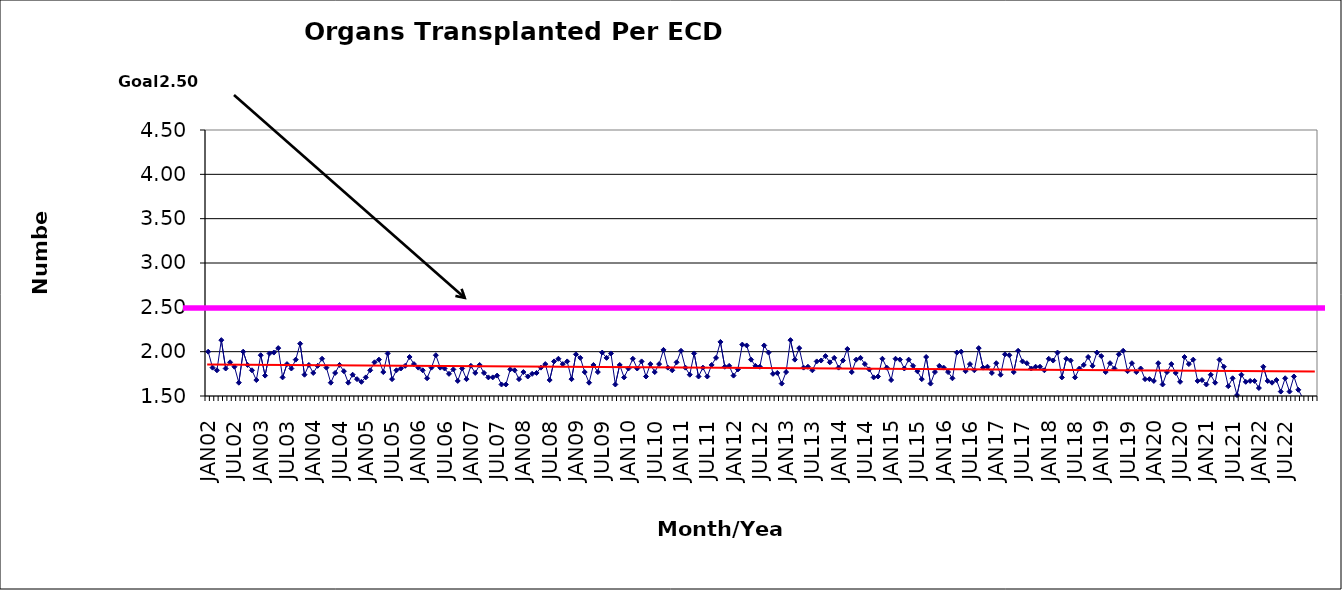
| Category | Series 0 |
|---|---|
| JAN02 | 2 |
| FEB02 | 1.82 |
| MAR02 | 1.79 |
| APR02 | 2.13 |
| MAY02 | 1.81 |
| JUN02 | 1.88 |
| JUL02 | 1.83 |
| AUG02 | 1.65 |
| SEP02 | 2 |
| OCT02 | 1.85 |
| NOV02 | 1.79 |
| DEC02 | 1.68 |
| JAN03 | 1.96 |
| FEB03 | 1.73 |
| MAR03 | 1.98 |
| APR03 | 1.99 |
| MAY03 | 2.04 |
| JUN03 | 1.71 |
| JUL03 | 1.86 |
| AUG03 | 1.81 |
| SEP03 | 1.91 |
| OCT03 | 2.09 |
| NOV03 | 1.74 |
| DEC03 | 1.85 |
| JAN04 | 1.76 |
| FEB04 | 1.84 |
| MAR04 | 1.92 |
| APR04 | 1.82 |
| MAY04 | 1.65 |
| JUN04 | 1.76 |
| JUL04 | 1.85 |
| AUG04 | 1.78 |
| SEP04 | 1.65 |
| OCT04 | 1.74 |
| NOV04 | 1.69 |
| DEC04 | 1.66 |
| JAN05 | 1.71 |
| FEB05 | 1.79 |
| MAR05 | 1.88 |
| APR05 | 1.91 |
| MAY05 | 1.77 |
| JUN05 | 1.98 |
| JUL05 | 1.69 |
| AUG05 | 1.79 |
| SEP05 | 1.81 |
| OCT05 | 1.84 |
| NOV05 | 1.94 |
| DEC05 | 1.86 |
| JAN06 | 1.82 |
| FEB06 | 1.79 |
| MAR06 | 1.7 |
| APR06 | 1.82 |
| MAY06 | 1.96 |
| JUN06 | 1.82 |
| JUL06 | 1.81 |
| AUG06 | 1.75 |
| SEP06 | 1.8 |
| OCT06 | 1.67 |
| NOV06 | 1.81 |
| DEC06 | 1.69 |
| JAN07 | 1.84 |
| FEB07 | 1.76 |
| MAR07 | 1.85 |
| APR07 | 1.76 |
| MAY07 | 1.71 |
| JUN07 | 1.71 |
| JUL07 | 1.73 |
| AUG07 | 1.63 |
| SEP07 | 1.63 |
| OCT07 | 1.8 |
| NOV07 | 1.79 |
| DEC07 | 1.69 |
| JAN08 | 1.77 |
| FEB08 | 1.72 |
| MAR08 | 1.75 |
| APR08 | 1.76 |
| MAY08 | 1.82 |
| JUN08 | 1.86 |
| JUL08 | 1.68 |
| AUG08 | 1.89 |
| SEP08 | 1.92 |
| OCT08 | 1.86 |
| NOV08 | 1.89 |
| DEC08 | 1.69 |
| JAN09 | 1.97 |
| FEB09 | 1.93 |
| MAR09 | 1.77 |
| APR09 | 1.65 |
| MAY09 | 1.85 |
| JUN09 | 1.77 |
| JUL09 | 1.99 |
| AUG09 | 1.93 |
| SEP09 | 1.98 |
| OCT09 | 1.63 |
| NOV09 | 1.85 |
| DEC09 | 1.71 |
| JAN10 | 1.81 |
| FEB10 | 1.92 |
| MAR10 | 1.81 |
| APR10 | 1.89 |
| MAY10 | 1.72 |
| JUN10 | 1.86 |
| JUL10 | 1.77 |
| AUG10 | 1.86 |
| SEP10 | 2.02 |
| OCT10 | 1.82 |
| NOV10 | 1.79 |
| DEC10 | 1.88 |
| JAN11 | 2.01 |
| FEB11 | 1.82 |
| MAR11 | 1.74 |
| APR11 | 1.98 |
| MAY11 | 1.72 |
| JUN11 | 1.82 |
| JUL11 | 1.72 |
| AUG11 | 1.85 |
| SEP11 | 1.93 |
| OCT11 | 2.11 |
| NOV11 | 1.83 |
| DEC11 | 1.84 |
| JAN12 | 1.73 |
| FEB12 | 1.8 |
| MAR12 | 2.08 |
| APR12 | 2.07 |
| MAY12 | 1.91 |
| JUN12 | 1.84 |
| JUL12 | 1.83 |
| AUG12 | 2.07 |
| SEP12 | 1.99 |
| OCT12 | 1.75 |
| NOV12 | 1.76 |
| DEC12 | 1.64 |
| JAN13 | 1.77 |
| FEB13 | 2.13 |
| MAR13 | 1.91 |
| APR13 | 2.04 |
| MAY13 | 1.82 |
| JUN13 | 1.83 |
| JUL13 | 1.79 |
| AUG13 | 1.89 |
| SEP13 | 1.9 |
| OCT13 | 1.95 |
| NOV13 | 1.88 |
| DEC13 | 1.93 |
| JAN14 | 1.82 |
| FEB14 | 1.9 |
| MAR14 | 2.03 |
| APR14 | 1.77 |
| MAY14 | 1.91 |
| JUN14 | 1.93 |
| JUL14 | 1.86 |
| AUG14 | 1.8 |
| SEP14 | 1.71 |
| OCT14 | 1.72 |
| NOV14 | 1.92 |
| DEC14 | 1.82 |
| JAN15 | 1.68 |
| FEB15 | 1.92 |
| MAR15 | 1.91 |
| APR15 | 1.81 |
| MAY15 | 1.91 |
| JUN15 | 1.84 |
| JUL15 | 1.78 |
| AUG15 | 1.69 |
| SEP15 | 1.94 |
| OCT15 | 1.64 |
| NOV15 | 1.77 |
| DEC15 | 1.84 |
| JAN16 | 1.82 |
| FEB16 | 1.77 |
| MAR16 | 1.7 |
| APR16 | 1.99 |
| MAY16 | 2 |
| JUN16 | 1.78 |
| JUL16 | 1.86 |
| AUG16 | 1.79 |
| SEP16 | 2.04 |
| OCT16 | 1.82 |
| NOV16 | 1.83 |
| DEC16 | 1.76 |
| JAN17 | 1.87 |
| FEB17 | 1.74 |
| MAR17 | 1.97 |
| APR17 | 1.96 |
| MAY17 | 1.77 |
| JUN17 | 2.01 |
| JUL17 | 1.89 |
| AUG17 | 1.87 |
| SEP17 | 1.81 |
| OCT17 | 1.83 |
| NOV17 | 1.83 |
| DEC17 | 1.79 |
| JAN18 | 1.92 |
| FEB18 | 1.9 |
| MAR18 | 1.99 |
| APR18 | 1.71 |
| MAY18 | 1.92 |
| JUN18 | 1.9 |
| JUL18 | 1.71 |
| AUG18 | 1.81 |
| SEP18 | 1.85 |
| OCT18 | 1.94 |
| NOV18 | 1.84 |
| DEC18 | 1.99 |
| JAN19 | 1.95 |
| FEB19 | 1.77 |
| MAR19 | 1.87 |
| APR19 | 1.81 |
| MAY19 | 1.97 |
| JUN19 | 2.01 |
| JUL19 | 1.78 |
| AUG19 | 1.87 |
| SEP19 | 1.77 |
| OCT19 | 1.81 |
| NOV19 | 1.69 |
| DEC19 | 1.69 |
| JAN20 | 1.67 |
| FEB20 | 1.87 |
| MAR20 | 1.63 |
| APR20 | 1.77 |
| MAY20 | 1.86 |
| JUN20 | 1.76 |
| JUL20 | 1.66 |
| AUG20 | 1.94 |
| SEP20 | 1.86 |
| OCT20 | 1.91 |
| NOV20 | 1.67 |
| DEC20 | 1.68 |
| JAN21 | 1.63 |
| FEB21 | 1.74 |
| MAR21 | 1.65 |
| APR21 | 1.91 |
| MAY21 | 1.83 |
| JUN21 | 1.61 |
| JUL21 | 1.7 |
| AUG21 | 1.51 |
| SEP21 | 1.74 |
| OCT21 | 1.66 |
| NOV21 | 1.67 |
| DEC21 | 1.67 |
| JAN22 | 1.59 |
| FEB22 | 1.83 |
| MAR22 | 1.67 |
| APR22 | 1.65 |
| MAY22 | 1.68 |
| JUN22 | 1.55 |
| JUL22 | 1.7 |
| AUG22 | 1.55 |
| SEP22 | 1.72 |
| OCT22 | 1.57 |
| NOV22 | 1.48 |
| DEC22 | 1.42 |